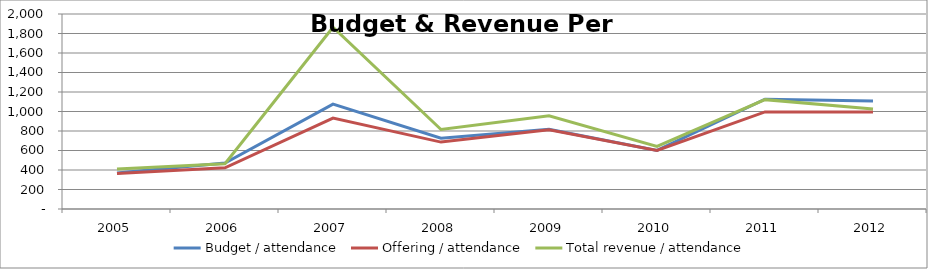
| Category | Budget / attendance | Offering / attendance | Total revenue / attendance |
|---|---|---|---|
| 2005.0 | 370.236 | 363.325 | 410.222 |
| 2006.0 | 470.95 | 422.816 | 464.112 |
| 2007.0 | 1075.715 | 932.287 | 1864.573 |
| 2008.0 | 725.081 | 686.138 | 815.59 |
| 2009.0 | 817.867 | 811.848 | 955.029 |
| 2010.0 | 601.214 | 600.008 | 641.692 |
| 2011.0 | 1126.021 | 995.402 | 1121.617 |
| 2012.0 | 1106.718 | 994.519 | 1025.093 |